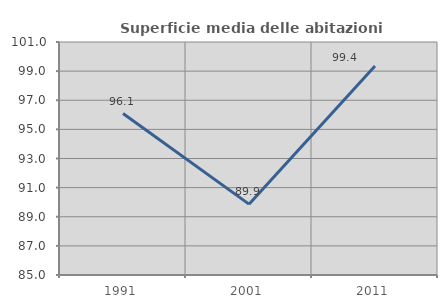
| Category | Superficie media delle abitazioni occupate |
|---|---|
| 1991.0 | 96.086 |
| 2001.0 | 89.865 |
| 2011.0 | 99.354 |